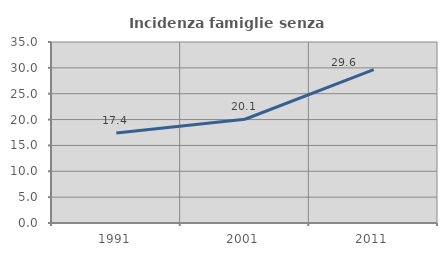
| Category | Incidenza famiglie senza nuclei |
|---|---|
| 1991.0 | 17.392 |
| 2001.0 | 20.061 |
| 2011.0 | 29.645 |